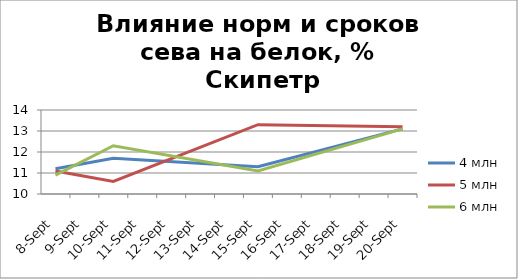
| Category | 4 млн | 5 млн | 6 млн |
|---|---|---|---|
| 2016-09-08 | 11.2 | 11.1 | 10.9 |
| 2016-09-10 | 11.7 | 10.6 | 12.3 |
| 2016-09-15 | 11.3 | 13.3 | 11.1 |
| 2016-09-20 | 13.1 | 13.2 | 13.1 |